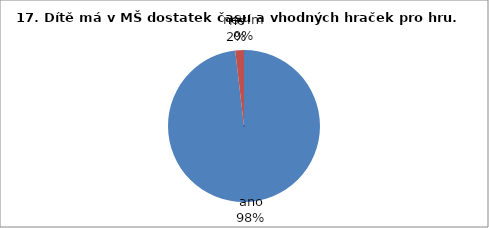
| Category | 17. |
|---|---|
| ano | 53 |
| ne | 1 |
| nevím | 0 |